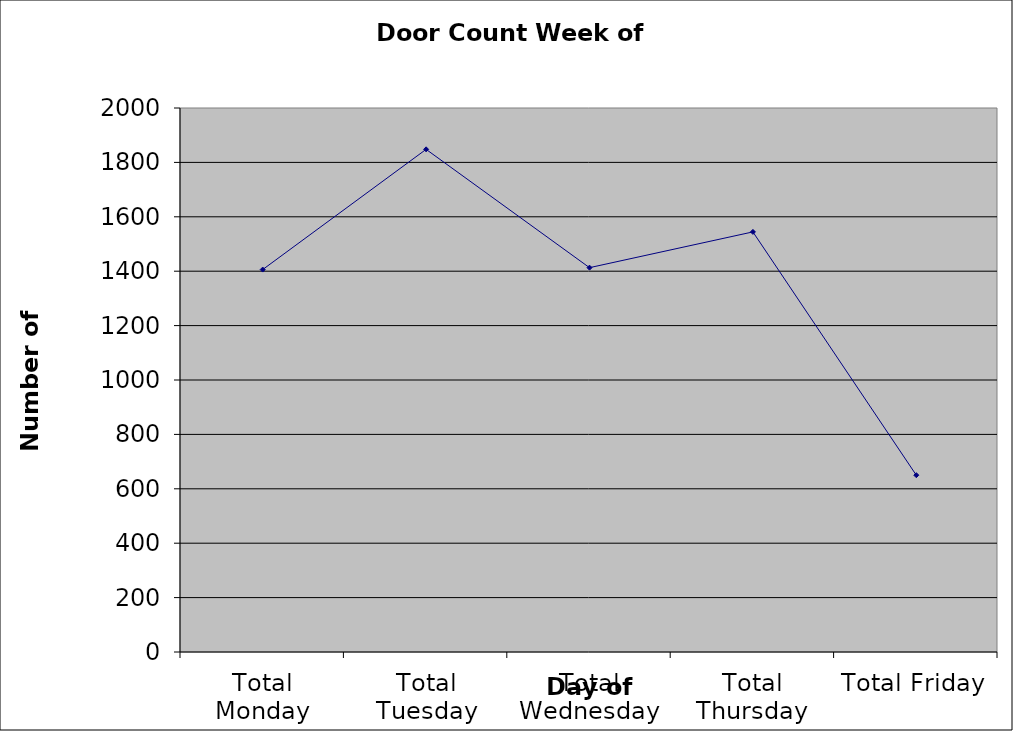
| Category | Series 0 |
|---|---|
| Total Monday | 1406 |
| Total Tuesday | 1848 |
| Total Wednesday | 1413 |
| Total Thursday | 1544.5 |
| Total Friday | 650 |